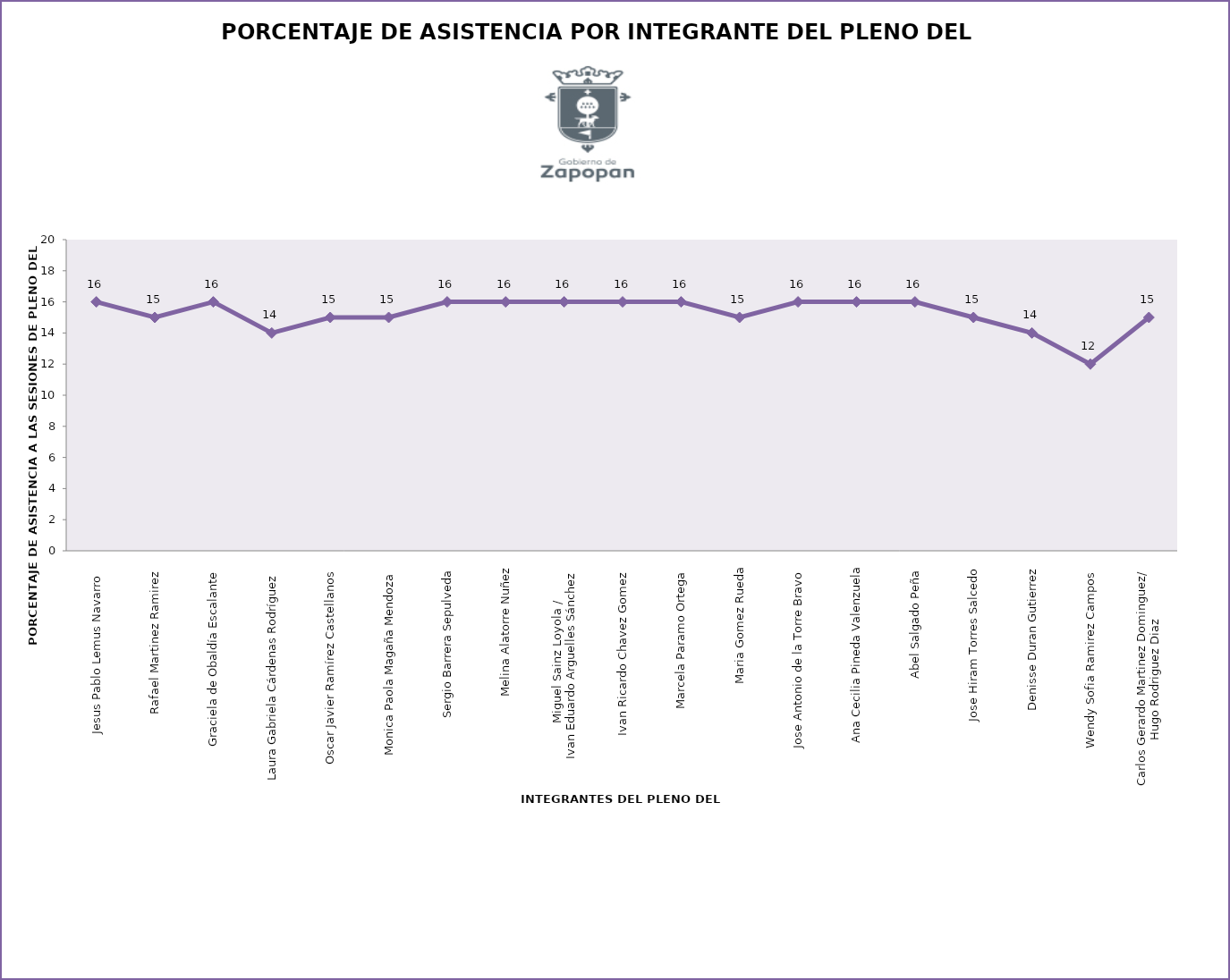
| Category | Series 0 |
|---|---|
| Jesus Pablo Lemus Navarro   | 16 |
| Rafael Martinez Ramirez  | 15 |
| Graciela de Obaldía Escalante  | 16 |
| Laura Gabriela Cárdenas Rodríguez  | 14 |
| Oscar Javier Ramírez Castellanos  | 15 |
| Monica Paola Magaña Mendoza  | 15 |
| Sergio Barrera Sepulveda | 16 |
| Melina Alatorre Nuñez | 16 |
| Miguel Sainz Loyola /
Ivan Eduardo Arguelles Sánchez  | 16 |
| Ivan Ricardo Chavez Gomez  | 16 |
| Marcela Paramo Ortega  | 16 |
| Maria Gomez Rueda | 15 |
| Jose Antonio de la Torre Bravo  | 16 |
| Ana Cecilia Pineda Valenzuela | 16 |
| Abel Salgado Peña  | 16 |
| Jose Hiram Torres Salcedo | 15 |
| Denisse Duran Gutierrez | 14 |
| Wendy Sofia Ramirez Campos  | 12 |
| Carlos Gerardo Martinez Dominguez/
Hugo Rodriguez Diaz  | 15 |